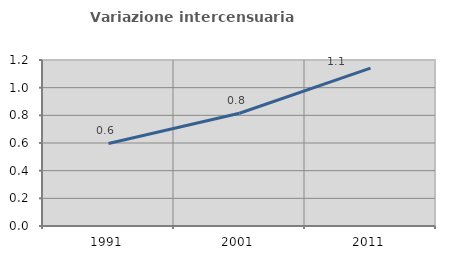
| Category | Variazione intercensuaria annua |
|---|---|
| 1991.0 | 0.597 |
| 2001.0 | 0.815 |
| 2011.0 | 1.141 |